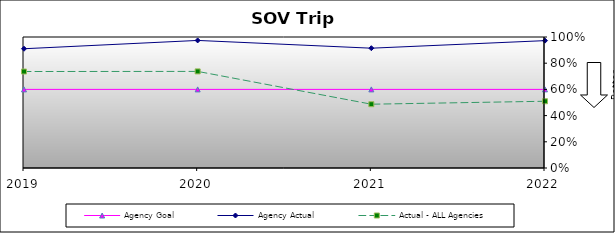
| Category | Agency Goal | Agency Actual | Actual - ALL Agencies |
|---|---|---|---|
| 2019.0 | 0.6 | 0.91 | 0.736 |
| 2020.0 | 0.6 | 0.974 | 0.737 |
| 2021.0 | 0.6 | 0.914 | 0.487 |
| 2022.0 | 0.6 | 0.972 | 0.509 |